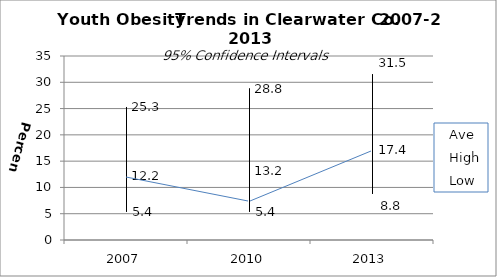
| Category | Ave | High | Low |
|---|---|---|---|
| 2007.0 | 12.2 | 25.3 | 5.4 |
| 2010.0 | 13.2 | 28.8 | 5.4 |
| 2013.0 | 17.4 | 31.5 | 8.8 |